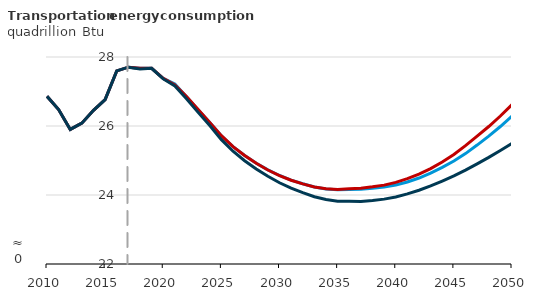
| Category | Autonomous battery electric vehicle | Autonomous hybrid electric vehicle  | Reference |
|---|---|---|---|
| 2010.0 | 26.862 | 26.862 | 26.862 |
| 2011.0 | 26.475 | 26.475 | 26.475 |
| 2012.0 | 25.901 | 25.901 | 25.901 |
| 2013.0 | 26.082 | 26.082 | 26.082 |
| 2014.0 | 26.455 | 26.455 | 26.455 |
| 2015.0 | 26.764 | 26.764 | 26.764 |
| 2016.0 | 27.598 | 27.598 | 27.599 |
| 2017.0 | 27.706 | 27.706 | 27.705 |
| 2018.0 | 27.674 | 27.675 | 27.651 |
| 2019.0 | 27.671 | 27.672 | 27.67 |
| 2020.0 | 27.379 | 27.379 | 27.365 |
| 2021.0 | 27.22 | 27.191 | 27.159 |
| 2022.0 | 26.848 | 26.851 | 26.791 |
| 2023.0 | 26.471 | 26.475 | 26.396 |
| 2024.0 | 26.103 | 26.105 | 26.012 |
| 2025.0 | 25.717 | 25.72 | 25.605 |
| 2026.0 | 25.401 | 25.402 | 25.268 |
| 2027.0 | 25.143 | 25.145 | 24.994 |
| 2028.0 | 24.921 | 24.92 | 24.757 |
| 2029.0 | 24.728 | 24.725 | 24.542 |
| 2030.0 | 24.565 | 24.561 | 24.356 |
| 2031.0 | 24.431 | 24.428 | 24.198 |
| 2032.0 | 24.327 | 24.321 | 24.067 |
| 2033.0 | 24.233 | 24.233 | 23.95 |
| 2034.0 | 24.176 | 24.181 | 23.869 |
| 2035.0 | 24.149 | 24.158 | 23.817 |
| 2036.0 | 24.162 | 24.179 | 23.82 |
| 2037.0 | 24.168 | 24.196 | 23.815 |
| 2038.0 | 24.198 | 24.237 | 23.841 |
| 2039.0 | 24.231 | 24.287 | 23.88 |
| 2040.0 | 24.292 | 24.365 | 23.943 |
| 2041.0 | 24.377 | 24.472 | 24.031 |
| 2042.0 | 24.492 | 24.605 | 24.137 |
| 2043.0 | 24.632 | 24.767 | 24.262 |
| 2044.0 | 24.799 | 24.957 | 24.405 |
| 2045.0 | 24.984 | 25.176 | 24.553 |
| 2046.0 | 25.2 | 25.431 | 24.721 |
| 2047.0 | 25.447 | 25.707 | 24.903 |
| 2048.0 | 25.707 | 25.986 | 25.091 |
| 2049.0 | 25.985 | 26.289 | 25.289 |
| 2050.0 | 26.286 | 26.621 | 25.493 |